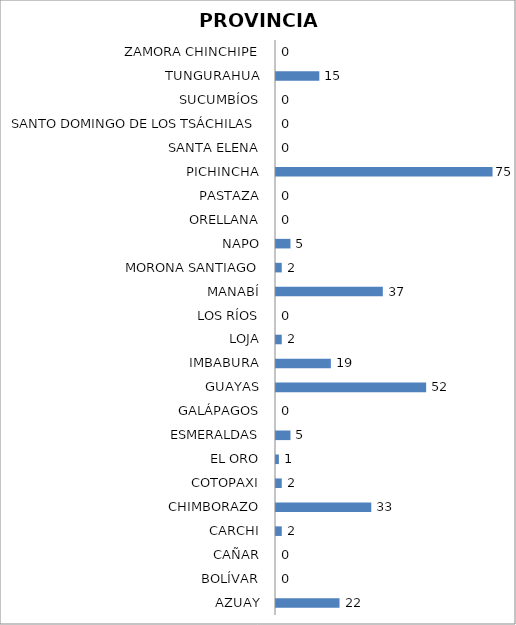
| Category | Series 0 |
|---|---|
| AZUAY | 22 |
| BOLÍVAR | 0 |
| CAÑAR | 0 |
| CARCHI | 2 |
| CHIMBORAZO | 33 |
| COTOPAXI | 2 |
| EL ORO | 1 |
| ESMERALDAS | 5 |
| GALÁPAGOS | 0 |
| GUAYAS | 52 |
| IMBABURA | 19 |
| LOJA | 2 |
| LOS RÍOS | 0 |
| MANABÍ | 37 |
| MORONA SANTIAGO | 2 |
| NAPO | 5 |
| ORELLANA | 0 |
| PASTAZA | 0 |
| PICHINCHA | 75 |
| SANTA ELENA | 0 |
| SANTO DOMINGO DE LOS TSÁCHILAS | 0 |
| SUCUMBÍOS | 0 |
| TUNGURAHUA | 15 |
| ZAMORA CHINCHIPE | 0 |